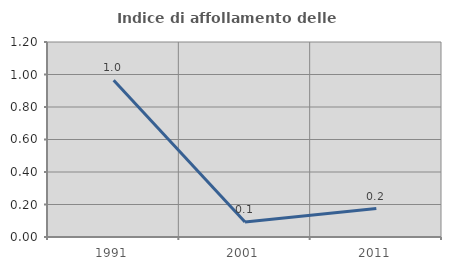
| Category | Indice di affollamento delle abitazioni  |
|---|---|
| 1991.0 | 0.964 |
| 2001.0 | 0.093 |
| 2011.0 | 0.175 |